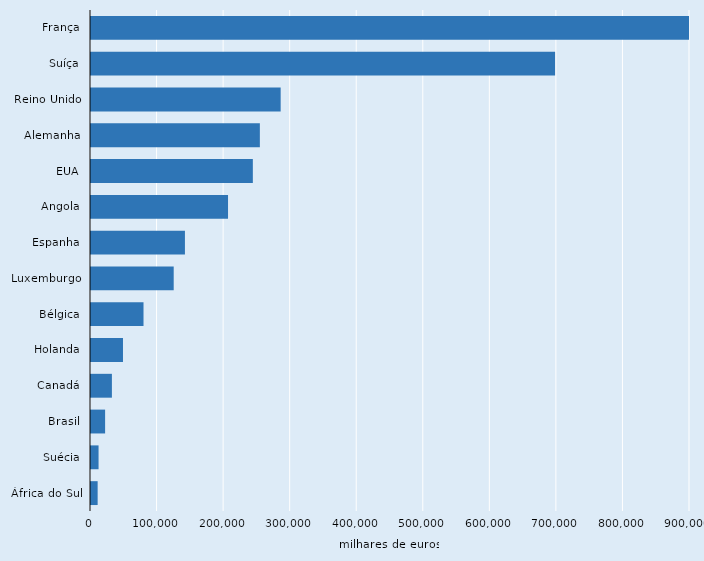
| Category | Series 2 |
|---|---|
| França | 1122570 |
| Suíça | 697280 |
| Reino Unido | 284970 |
| Alemanha | 253710 |
| EUA | 243170 |
| Angola | 205890 |
| Espanha | 141140 |
| Luxemburgo | 124260 |
| Bélgica | 78900 |
| Holanda | 48060 |
| Canadá | 31400 |
| Brasil | 21200 |
| Suécia | 11360 |
| África do Sul | 9980 |